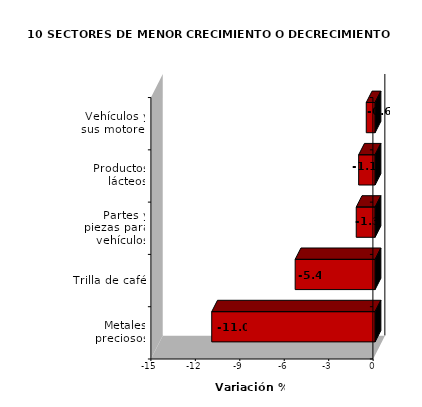
| Category | Series 0 |
|---|---|
| Vehículos y sus motores | -0.597 |
| Productos lácteos | -1.11 |
| Partes y piezas para vehículos | -1.274 |
| Trilla de café | -5.396 |
| Metales preciosos | -11.027 |